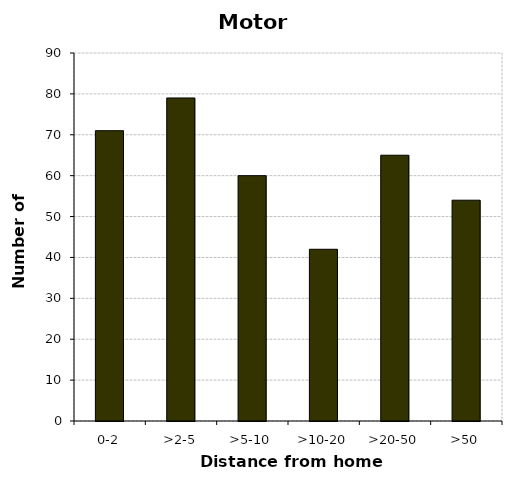
| Category | Motorcycles |
|---|---|
| 0-2 | 71 |
| >2-5 | 79 |
| >5-10 | 60 |
| >10-20 | 42 |
| >20-50 | 65 |
| >50 | 54 |